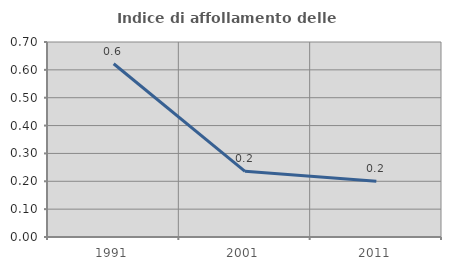
| Category | Indice di affollamento delle abitazioni  |
|---|---|
| 1991.0 | 0.622 |
| 2001.0 | 0.236 |
| 2011.0 | 0.2 |